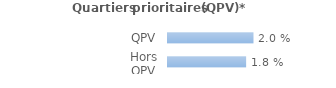
| Category | Series 0 |
|---|---|
| QPV | 0.02 |
| Hors QPV | 0.018 |